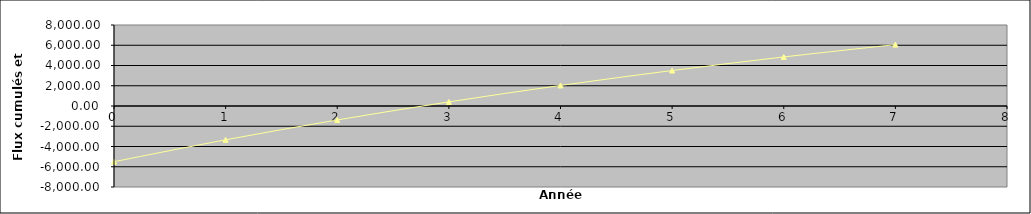
| Category | Flux cumulés et actualisés |
|---|---|
| 0.0 | -5500 |
| 1.0 | -3340.909 |
| 2.0 | -1378.099 |
| 3.0 | 406.273 |
| 4.0 | 2028.43 |
| 5.0 | 3503.119 |
| 6.0 | 4843.744 |
| 7.0 | 6062.495 |